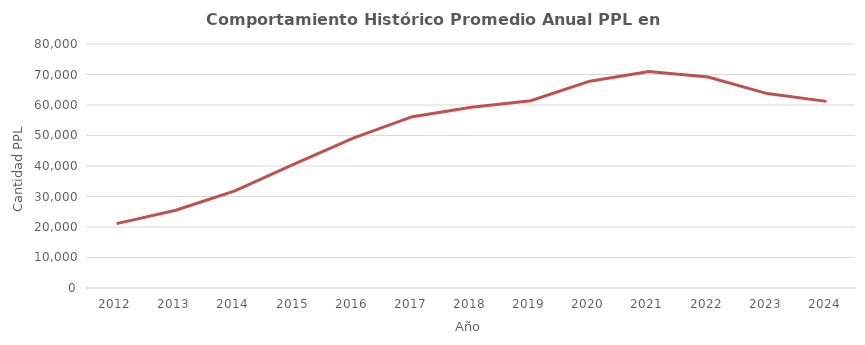
| Category | Promedio anual Domiciliaria |
|---|---|
| 2012.0 | 21098.25 |
| 2013.0 | 25499.083 |
| 2014.0 | 31836.75 |
| 2015.0 | 40614.5 |
| 2016.0 | 49161.167 |
| 2017.0 | 56180.75 |
| 2018.0 | 59289.25 |
| 2019.0 | 61380.5 |
| 2020.0 | 67811 |
| 2021.0 | 70980.5 |
| 2022.0 | 69173.833 |
| 2023.0 | 63744.25 |
| 2024.0 | 61191 |